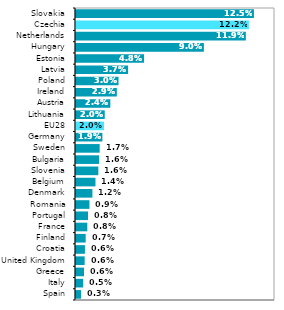
| Category | Series 0 |
|---|---|
| Spain | 0.003 |
| Italy | 0.005 |
| Greece | 0.006 |
| United Kingdom | 0.006 |
| Croatia | 0.006 |
| Finland | 0.007 |
| France | 0.008 |
| Portugal | 0.008 |
| Romania | 0.009 |
| Denmark | 0.012 |
| Belgium | 0.014 |
| Slovenia | 0.016 |
| Bulgaria | 0.016 |
| Sweden | 0.017 |
| Germany | 0.019 |
| EU28 | 0.02 |
| Lithuania | 0.02 |
| Austria | 0.024 |
| Ireland | 0.029 |
| Poland | 0.03 |
| Latvia | 0.037 |
| Estonia | 0.048 |
| Hungary | 0.09 |
| Netherlands | 0.119 |
| Czechia | 0.122 |
| Slovakia | 0.125 |